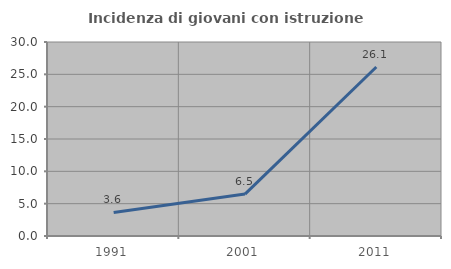
| Category | Incidenza di giovani con istruzione universitaria |
|---|---|
| 1991.0 | 3.636 |
| 2001.0 | 6.481 |
| 2011.0 | 26.136 |